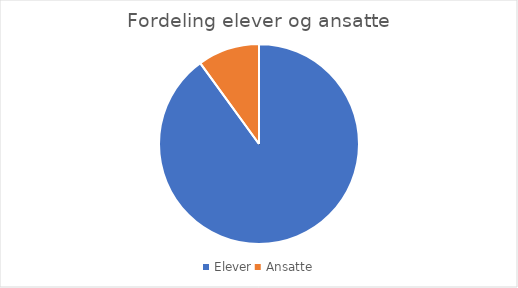
| Category | Series 0 |
|---|---|
| Elever | 612 |
| Ansatte | 68 |